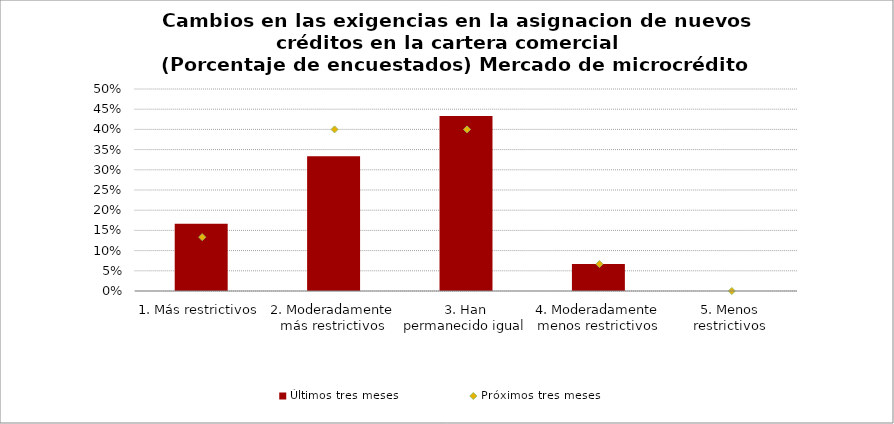
| Category | Últimos tres meses |
|---|---|
| 1. Más restrictivos | 0.167 |
| 2. Moderadamente más restrictivos | 0.333 |
| 3. Han permanecido igual | 0.433 |
| 4. Moderadamente menos restrictivos | 0.067 |
| 5. Menos restrictivos | 0 |